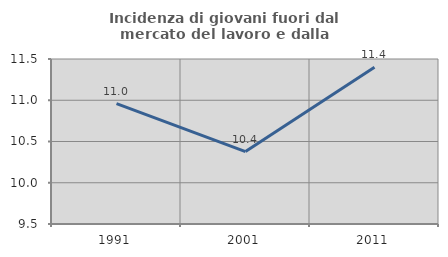
| Category | Incidenza di giovani fuori dal mercato del lavoro e dalla formazione  |
|---|---|
| 1991.0 | 10.959 |
| 2001.0 | 10.377 |
| 2011.0 | 11.399 |